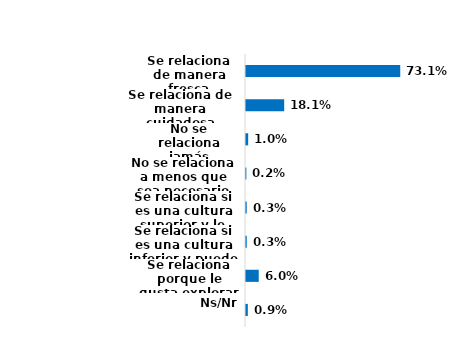
| Category | Series 0 |
|---|---|
| Se relaciona de manera fresca | 0.731 |
| Se relaciona de manera cuidadosa | 0.181 |
| No se relaciona jamás | 0.01 |
| No se relaciona a menos que sea necesario | 0.002 |
| Se relaciona si es una cultura superior y le conviene | 0.003 |
| Se relaciona si es una cultura inferior y puede ayudarle | 0.003 |
| Se relaciona porque le gusta explorar cosas desconocidas | 0.06 |
| Ns/Nr | 0.009 |